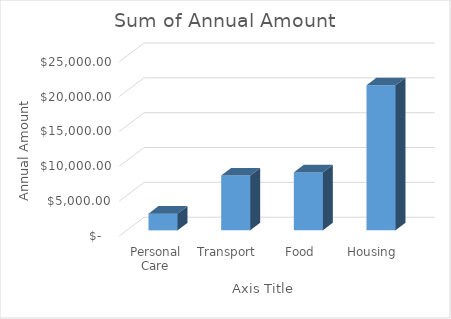
| Category | Total |
|---|---|
| Personal Care | 2400 |
| Transport | 7860 |
| Food | 8320 |
| Housing | 20840 |